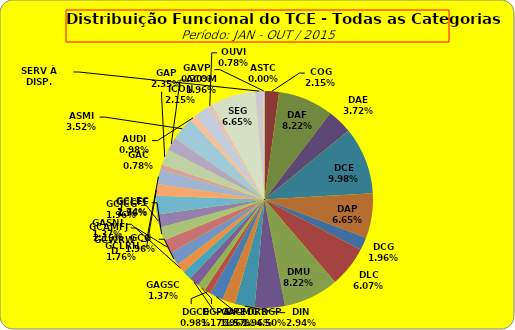
| Category | ASTC COG DAF DAE DCE DAP DCG DLC DMU DGP DIN DPE DRR DGCE DGPA GACMG GAGSC GASNI GCG GCAMFJ GCCFF GCJCG GCLEC GCLRH GCWRWD GAC GAP ACOM ASMI AUDI ICON OUVI SEG SERV À DISP. GAVP |
|---|---|
| ASTC | 0 |
| COG | 11 |
| DAF | 42 |
| DAE | 19 |
| DCE | 51 |
| DAP | 34 |
| DCG | 10 |
| DLC | 31 |
| DMU | 42 |
| DGP | 23 |
| DIN | 15 |
| DPE | 10 |
| DRR | 10 |
| DGCE | 5 |
| DGPA | 6 |
| GACMG | 8 |
| GAGSC | 7 |
| GASNI | 7 |
| GCG | 10 |
| GCAMFJ | 11 |
| GCCFF | 10 |
| GCJCG | 10 |
| GCLEC | 14 |
| GCLRH | 9 |
| GCWRWD | 11 |
| GAC | 4 |
| GAP | 12 |
| ACOM | 10 |
| ASMI | 18 |
| AUDI | 5 |
| ICON | 11 |
| OUVI | 4 |
| SEG | 34 |
| SERV À DISP. | 6 |
| GAVP | 1 |